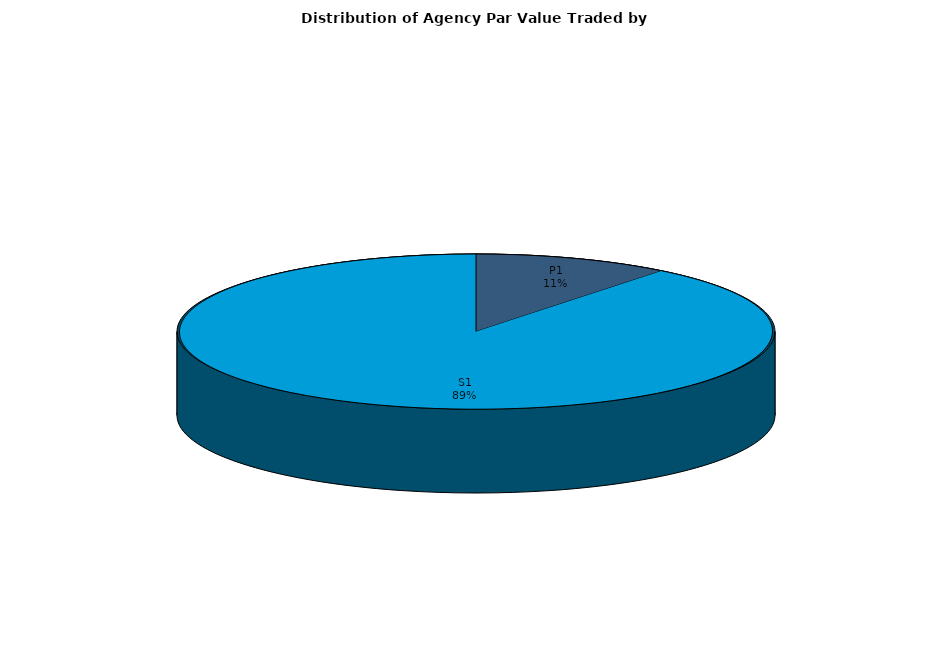
| Category | Series 0 |
|---|---|
| P1 | 496519398.406 |
| S1 | 4152194947.631 |